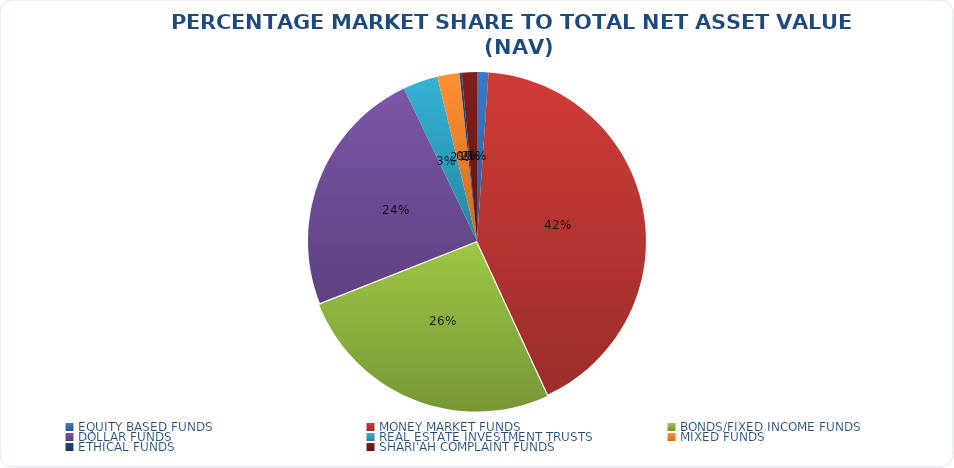
| Category | NET ASSET VALUE |
|---|---|
| EQUITY BASED FUNDS | 14878650973.37 |
| MONEY MARKET FUNDS | 574228446553.546 |
| BONDS/FIXED INCOME FUNDS | 354067957931.391 |
| DOLLAR FUNDS | 326189434068.445 |
| REAL ESTATE INVESTMENT TRUSTS | 45709841753.91 |
| MIXED FUNDS | 28963635112.849 |
| ETHICAL FUNDS | 2782426925.47 |
| SHARI'AH COMPLAINT FUNDS | 19799411572.15 |